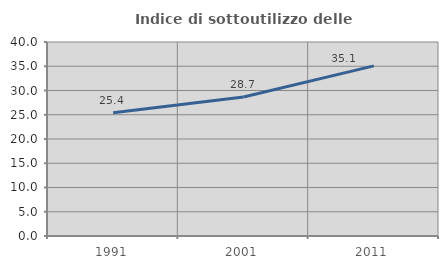
| Category | Indice di sottoutilizzo delle abitazioni  |
|---|---|
| 1991.0 | 25.391 |
| 2001.0 | 28.671 |
| 2011.0 | 35.082 |